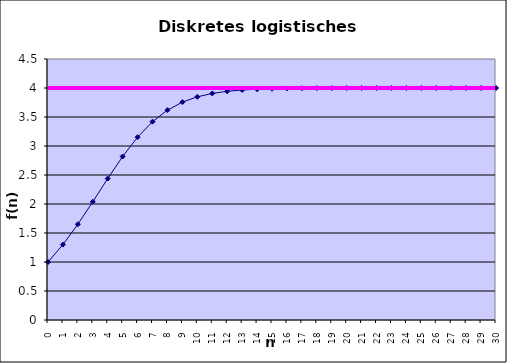
| Category | f(n) | g(n) |
|---|---|---|
| 0.0 | 1 | 4 |
| 1.0 | 1.3 | 4 |
| 2.0 | 1.651 | 4 |
| 3.0 | 2.039 | 4 |
| 4.0 | 2.439 | 4 |
| 5.0 | 2.819 | 4 |
| 6.0 | 3.152 | 4 |
| 7.0 | 3.42 | 4 |
| 8.0 | 3.618 | 4 |
| 9.0 | 3.756 | 4 |
| 10.0 | 3.848 | 4 |
| 11.0 | 3.906 | 4 |
| 12.0 | 3.943 | 4 |
| 13.0 | 3.965 | 4 |
| 14.0 | 3.979 | 4 |
| 15.0 | 3.987 | 4 |
| 16.0 | 3.992 | 4 |
| 17.0 | 3.995 | 4 |
| 18.0 | 3.997 | 4 |
| 19.0 | 3.998 | 4 |
| 20.0 | 3.999 | 4 |
| 21.0 | 3.999 | 4 |
| 22.0 | 4 | 4 |
| 23.0 | 4 | 4 |
| 24.0 | 4 | 4 |
| 25.0 | 4 | 4 |
| 26.0 | 4 | 4 |
| 27.0 | 4 | 4 |
| 28.0 | 4 | 4 |
| 29.0 | 4 | 4 |
| 30.0 | 4 | 4 |